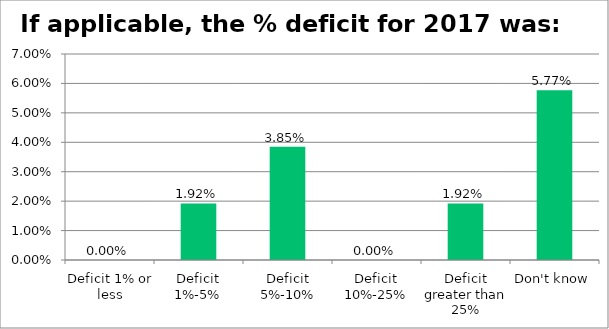
| Category | Responses |
|---|---|
| Deficit 1% or less | 0 |
| Deficit 1%-5% | 0.019 |
| Deficit 5%-10% | 0.038 |
| Deficit 10%-25% | 0 |
| Deficit greater than 25% | 0.019 |
| Don't know | 0.058 |